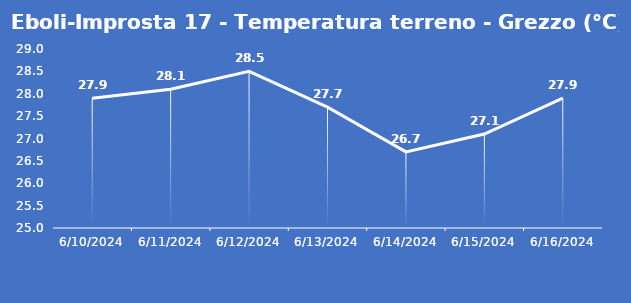
| Category | Eboli-Improsta 17 - Temperatura terreno - Grezzo (°C) |
|---|---|
| 6/10/24 | 27.9 |
| 6/11/24 | 28.1 |
| 6/12/24 | 28.5 |
| 6/13/24 | 27.7 |
| 6/14/24 | 26.7 |
| 6/15/24 | 27.1 |
| 6/16/24 | 27.9 |